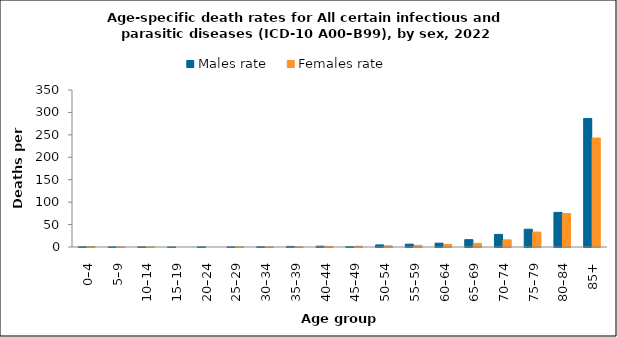
| Category | Males rate | Females rate |
|---|---|---|
| 0–4 | 0.643 | 1.087 |
| 5–9 | 0.362 | 0.128 |
| 10–14 | 0.356 | 0.126 |
| 15–19 | 0.126 | 0 |
| 20–24 | 0.355 | 0 |
| 25–29 | 0.324 | 0.443 |
| 30–34 | 0.528 | 0.207 |
| 35–39 | 1.276 | 0.419 |
| 40–44 | 1.782 | 1.275 |
| 45–49 | 0.747 | 1.709 |
| 50–54 | 4.669 | 2.62 |
| 55–59 | 6.362 | 3.717 |
| 60–64 | 8.546 | 5.477 |
| 65–69 | 16.419 | 8.141 |
| 70–74 | 28.122 | 16 |
| 75–79 | 39.649 | 33.247 |
| 80–84 | 77.223 | 74.381 |
| 85+ | 286.351 | 242.939 |